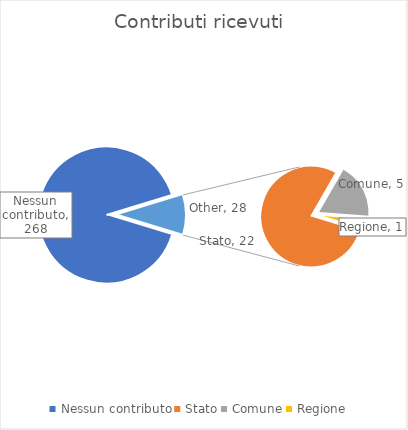
| Category | Series 0 |
|---|---|
| Nessun contributo | 268 |
| Stato | 22 |
| Comune | 5 |
| Regione | 1 |